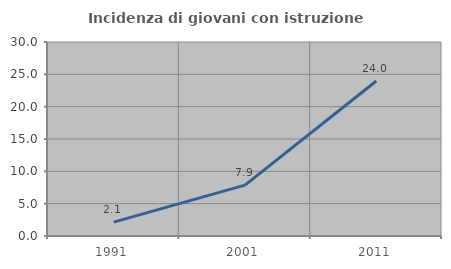
| Category | Incidenza di giovani con istruzione universitaria |
|---|---|
| 1991.0 | 2.139 |
| 2001.0 | 7.865 |
| 2011.0 | 23.973 |